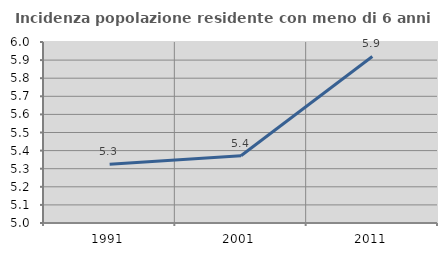
| Category | Incidenza popolazione residente con meno di 6 anni |
|---|---|
| 1991.0 | 5.324 |
| 2001.0 | 5.372 |
| 2011.0 | 5.92 |